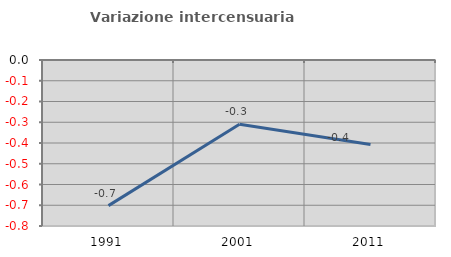
| Category | Variazione intercensuaria annua |
|---|---|
| 1991.0 | -0.702 |
| 2001.0 | -0.31 |
| 2011.0 | -0.407 |